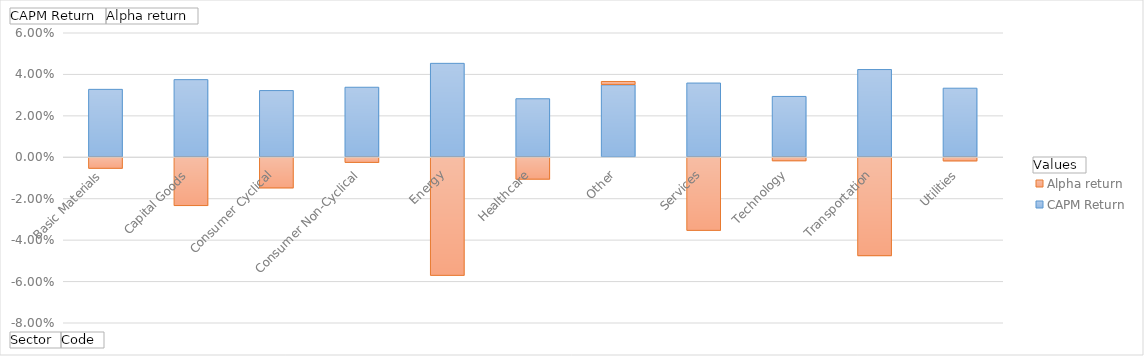
| Category | CAPM Return | Alpha return |
|---|---|---|
| Basic Materials | 0.033 | -0.006 |
| Capital Goods | 0.037 | -0.024 |
| Consumer Cyclical | 0.032 | -0.015 |
| Consumer Non-Cyclical | 0.034 | -0.003 |
| Energy | 0.045 | -0.057 |
| Healthcare | 0.028 | -0.011 |
| Other | 0.035 | 0.002 |
| Services | 0.036 | -0.036 |
| Technology | 0.029 | -0.002 |
| Transportation | 0.042 | -0.048 |
| Utilities | 0.033 | -0.002 |